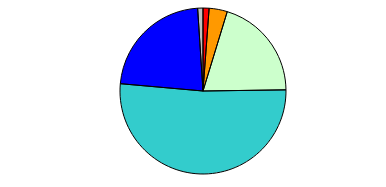
| Category | Series 0 |
|---|---|
| 0 | 8 |
| 1 | 24 |
| 2 | 136 |
| 3 | 350 |
| 4 | 153 |
| 5 | 7 |